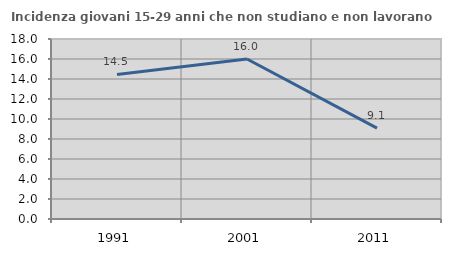
| Category | Incidenza giovani 15-29 anni che non studiano e non lavorano  |
|---|---|
| 1991.0 | 14.458 |
| 2001.0 | 16 |
| 2011.0 | 9.091 |